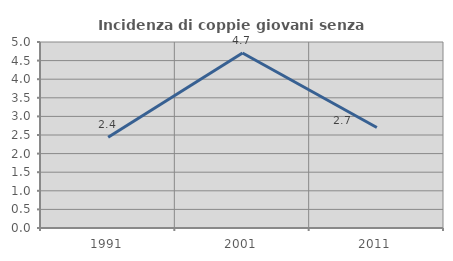
| Category | Incidenza di coppie giovani senza figli |
|---|---|
| 1991.0 | 2.439 |
| 2001.0 | 4.706 |
| 2011.0 | 2.703 |